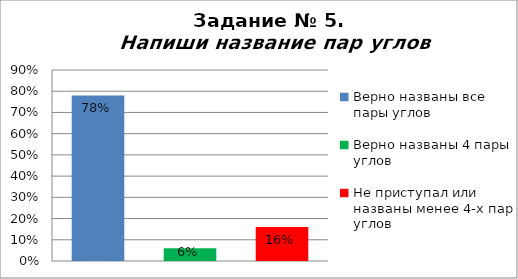
| Category | Напиши название пар углов |
|---|---|
| Верно названы все пары углов | 0.78 |
| Верно названы 4 пары углов | 0.06 |
| Не приступал или названы менее 4-х пар углов | 0.16 |